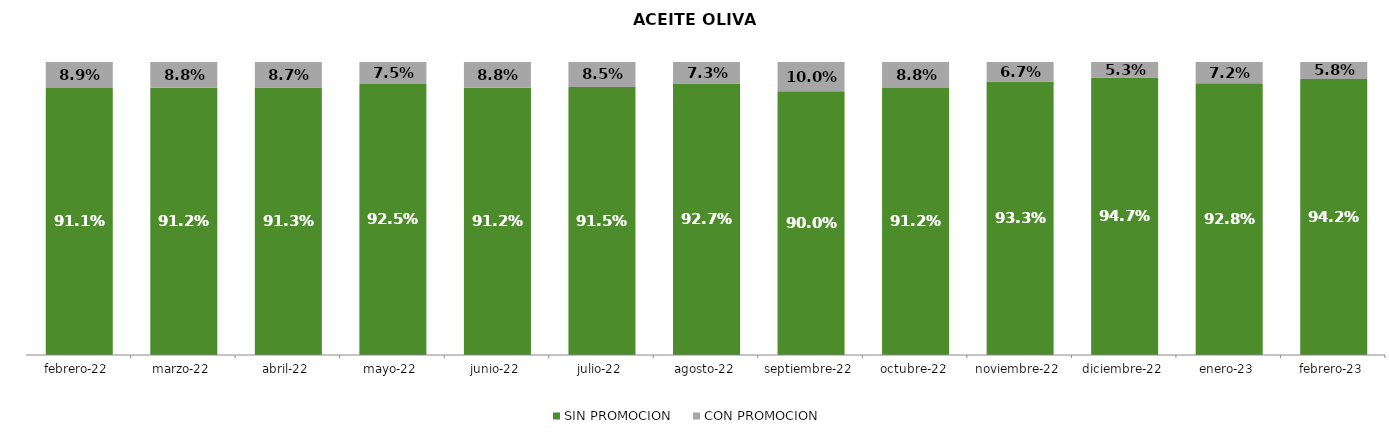
| Category | SIN PROMOCION   | CON PROMOCION   |
|---|---|---|
| 2022-02-01 | 0.911 | 0.089 |
| 2022-03-01 | 0.912 | 0.088 |
| 2022-04-01 | 0.913 | 0.087 |
| 2022-05-01 | 0.925 | 0.075 |
| 2022-06-01 | 0.912 | 0.088 |
| 2022-07-01 | 0.915 | 0.085 |
| 2022-08-01 | 0.927 | 0.073 |
| 2022-09-01 | 0.9 | 0.1 |
| 2022-10-01 | 0.912 | 0.088 |
| 2022-11-01 | 0.933 | 0.067 |
| 2022-12-01 | 0.947 | 0.053 |
| 2023-01-01 | 0.928 | 0.072 |
| 2023-02-01 | 0.942 | 0.058 |